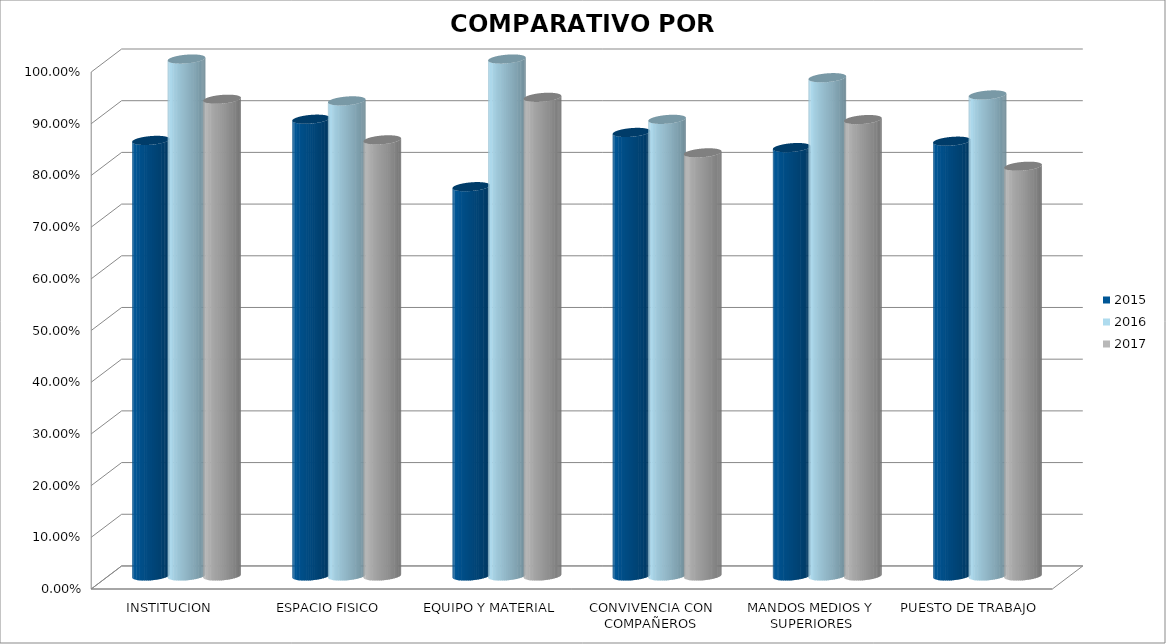
| Category | 2015 | 2016 | 2017 |
|---|---|---|---|
| INSTITUCION | 0.843 | 1 | 0.922 |
| ESPACIO FISICO | 0.884 | 0.919 | 0.844 |
| EQUIPO Y MATERIAL | 0.753 | 1 | 0.926 |
| CONVIVENCIA CON COMPAÑEROS | 0.858 | 0.883 | 0.819 |
| MANDOS MEDIOS Y SUPERIORES | 0.829 | 0.964 | 0.883 |
| PUESTO DE TRABAJO | 0.841 | 0.931 | 0.793 |